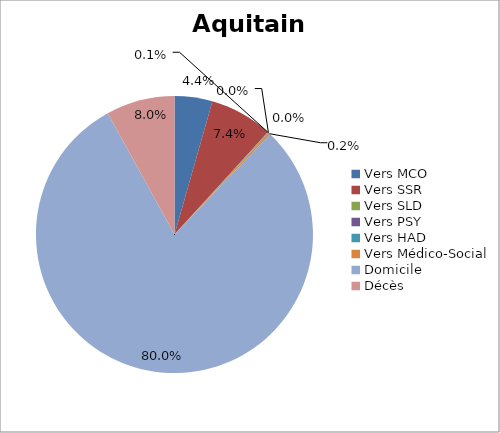
| Category | Aquitaine |
|---|---|
| Vers MCO | 0.044 |
| Vers SSR | 0.074 |
| Vers SLD | 0.001 |
| Vers PSY | 0 |
| Vers HAD | 0 |
| Vers Médico-Social | 0.002 |
| Domicile | 0.8 |
| Décès | 0.08 |